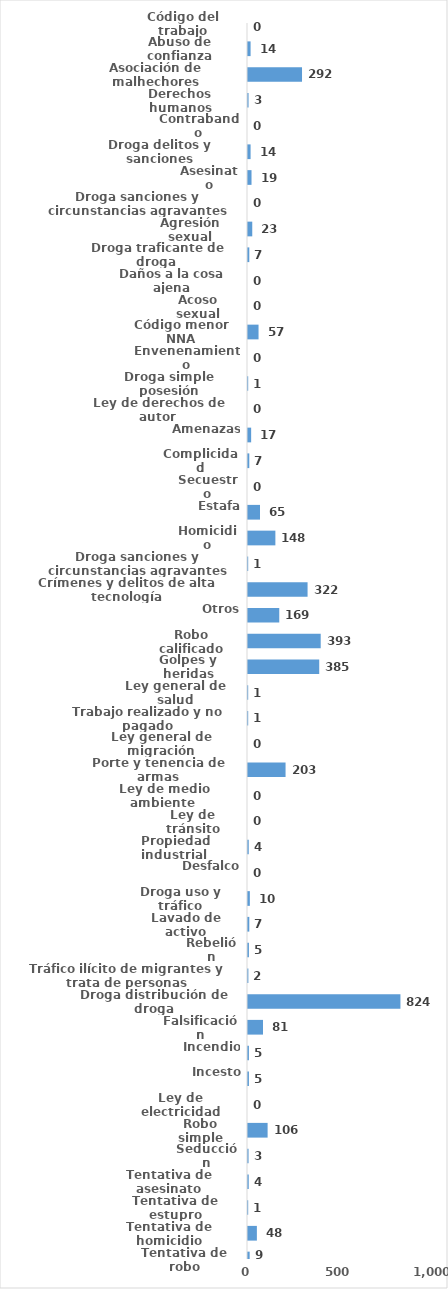
| Category | Series 0 |
|---|---|
| Código del trabajo | 0 |
| Abuso de confianza | 14 |
| Asociación de malhechores | 292 |
| Derechos humanos | 3 |
| Contrabando | 0 |
| Droga delitos y sanciones | 14 |
| Asesinato | 19 |
| Droga sanciones y circunstancias agravantes | 0 |
| Agresión sexual | 23 |
| Droga traficante de droga  | 7 |
| Daños a la cosa ajena | 0 |
| Acoso sexual | 0 |
| Código menor NNA | 57 |
| Envenenamiento | 0 |
| Droga simple posesión | 1 |
| Ley de derechos de autor  | 0 |
| Amenazas | 17 |
| Complicidad | 7 |
| Secuestro | 0 |
| Estafa | 65 |
| Homicidio | 148 |
| Droga sanciones y circunstancias agravantes | 1 |
| Crímenes y delitos de alta tecnología | 322 |
| Otros | 169 |
| Robo calificado | 393 |
| Golpes y heridas | 385 |
| Ley general de salud | 1 |
| Trabajo realizado y no pagado | 1 |
| Ley general de migración | 0 |
| Porte y tenencia de armas | 203 |
| Ley de medio ambiente  | 0 |
| Ley de tránsito | 0 |
| Propiedad industrial  | 4 |
| Desfalco | 0 |
| Droga uso y tráfico | 10 |
| Lavado de activo | 7 |
| Rebelión | 5 |
| Tráfico ilícito de migrantes y trata de personas | 2 |
| Droga distribución de droga | 824 |
| Falsificación | 81 |
| Incendio | 5 |
| Incesto | 5 |
| Ley de electricidad | 0 |
| Robo simple | 106 |
| Seducción | 3 |
| Tentativa de asesinato | 4 |
| Tentativa de estupro | 1 |
| Tentativa de homicidio | 48 |
| Tentativa de robo | 9 |